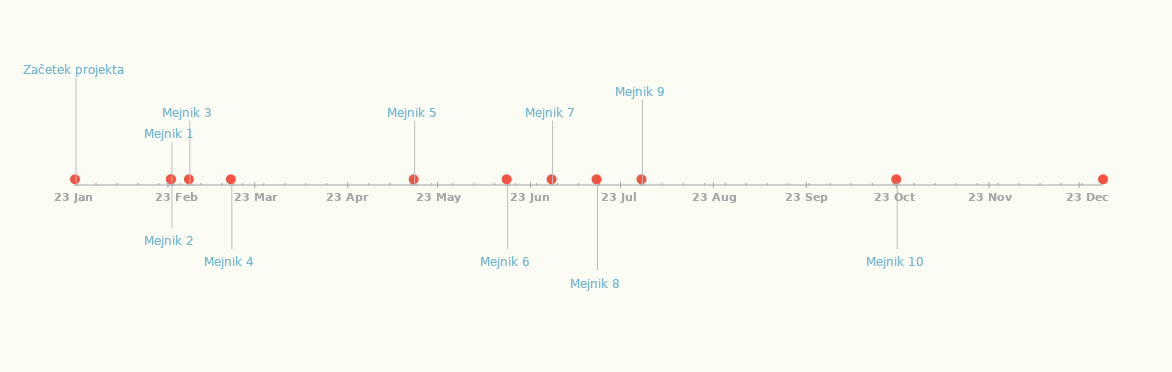
| Category | POLOŽAJ |
|---|---|
| Začetek projekta | 25 |
| Mejnik 1 | 10 |
| Mejnik 2 | -10 |
| Mejnik 3 | 15 |
| Mejnik 4 | -15 |
| Mejnik 5 | 15 |
| Mejnik 6 | -15 |
| Mejnik 7 | 15 |
| Mejnik 8 | -20 |
| Mejnik 9 | 20 |
| Mejnik 10 | -15 |
| Konec projekta | 15 |